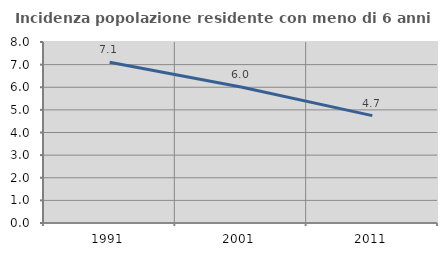
| Category | Incidenza popolazione residente con meno di 6 anni |
|---|---|
| 1991.0 | 7.105 |
| 2001.0 | 6.012 |
| 2011.0 | 4.745 |